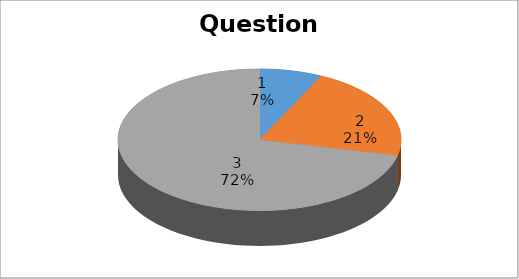
| Category | Series 0 |
|---|---|
| 0 | 1 |
| 1 | 3 |
| 2 | 10 |